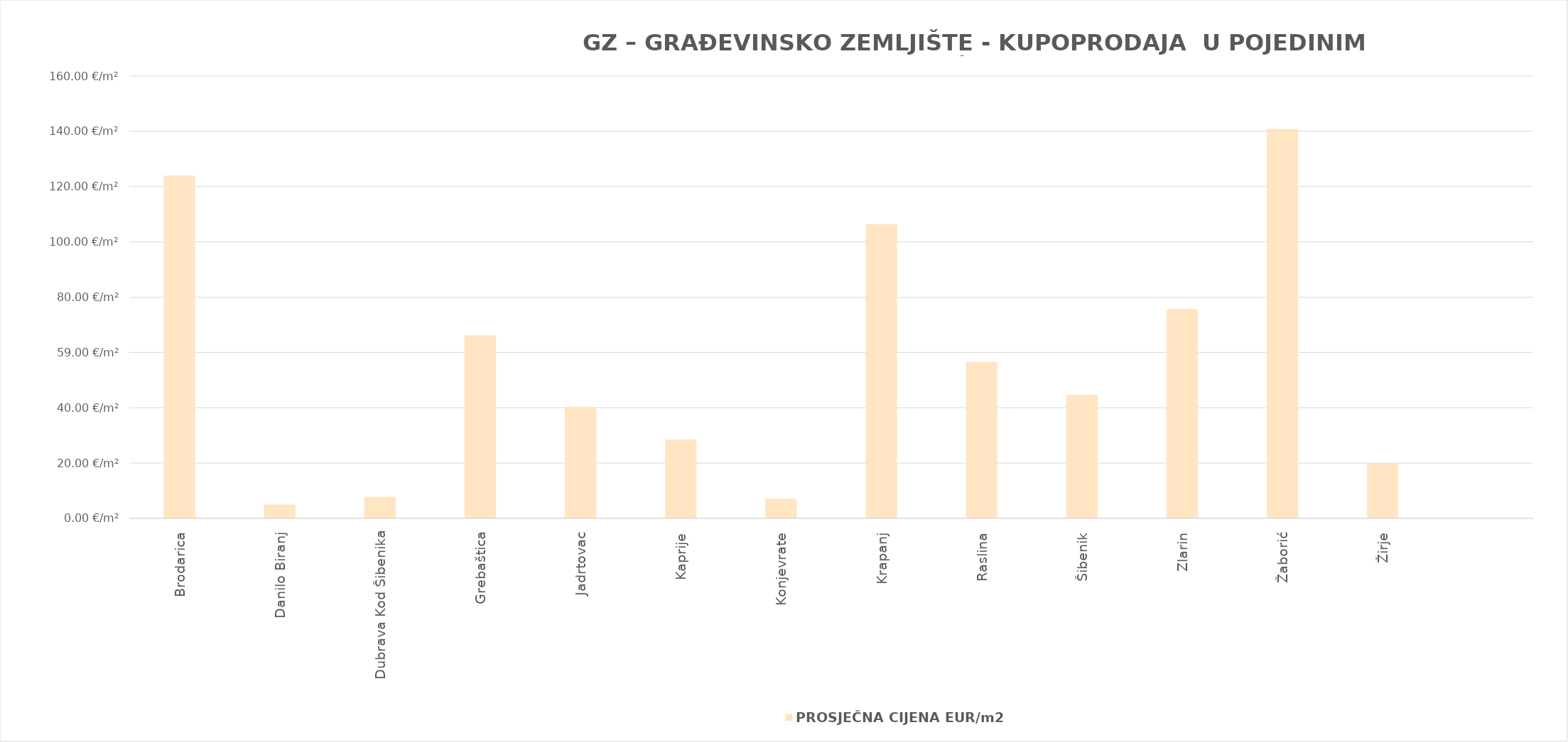
| Category | PROSJEČNA CIJENA EUR/m2 |
|---|---|
| Brodarica | 1900-05-02 23:04:24 |
| Danilo Biranj | 1900-01-05 00:25:22 |
| Dubrava Kod Šibenika | 1900-01-07 18:26:03 |
| Grebaštica | 1900-03-06 04:57:09 |
| Jadrtovac | 1900-02-09 05:49:24 |
| Kaprije | 1900-01-28 11:30:03 |
| Konjevrate | 1900-01-07 01:38:00 |
| Krapanj | 1900-04-15 08:35:27 |
| Raslina | 1900-02-25 15:26:58 |
| Šibenik | 1900-02-13 15:49:48 |
| Zlarin | 1900-03-15 16:25:38 |
| Žaborić | 1900-05-19 19:43:42 |
| Žirje | 1900-01-19 21:05:37 |